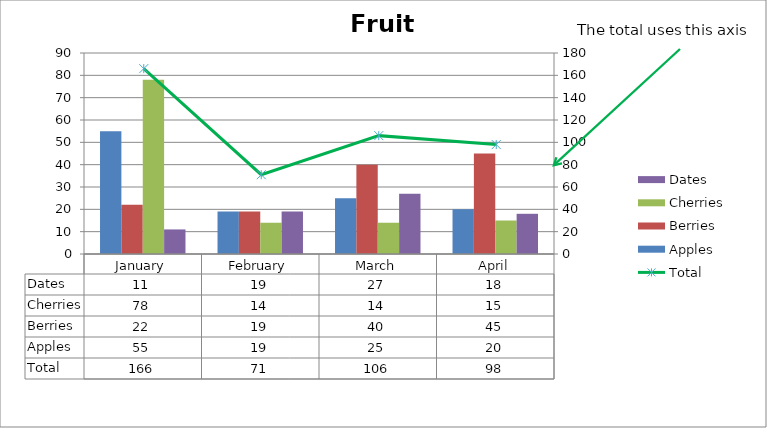
| Category | Apples | Berries | Cherries | Dates |
|---|---|---|---|---|
| January | 55 | 22 | 78 | 11 |
| February | 19 | 19 | 14 | 19 |
| March | 25 | 40 | 14 | 27 |
| April | 20 | 45 | 15 | 18 |